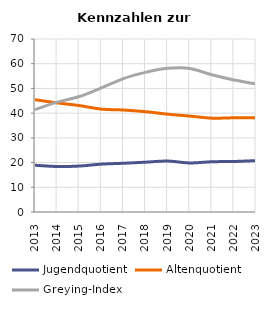
| Category | Jugendquotient | Altenquotient | Greying-Index |
|---|---|---|---|
| 2013.0 | 18.918 | 45.441 | 41.42 |
| 2014.0 | 18.406 | 44.153 | 44.433 |
| 2015.0 | 18.589 | 43.07 | 46.715 |
| 2016.0 | 19.361 | 41.634 | 50.216 |
| 2017.0 | 19.718 | 41.268 | 54 |
| 2018.0 | 20.154 | 40.589 | 56.507 |
| 2019.0 | 20.611 | 39.591 | 58.124 |
| 2020.0 | 19.85 | 38.81 | 58.09 |
| 2021.0 | 20.331 | 37.974 | 55.518 |
| 2022.0 | 20.44 | 38.12 | 53.43 |
| 2023.0 | 20.788 | 38.185 | 51.844 |